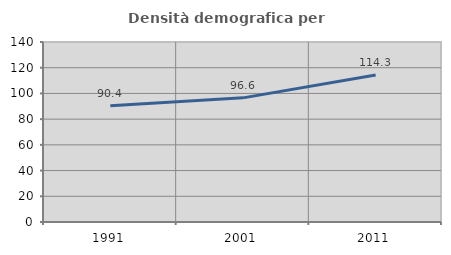
| Category | Densità demografica |
|---|---|
| 1991.0 | 90.432 |
| 2001.0 | 96.558 |
| 2011.0 | 114.299 |